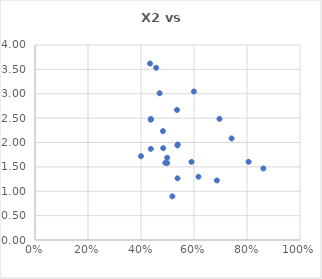
| Category | X3 |
|---|---|
| 0.805833 | 1.604 |
| 0.696087 | 2.485 |
| 0.437273 | 2.483 |
| 0.590435 | 1.603 |
| 0.436957 | 1.869 |
| 0.518261 | 0.896 |
| 0.498696 | 1.687 |
| 0.535833 | 2.668 |
| 0.434167 | 3.62 |
| 0.482917 | 2.233 |
| 0.686364 | 1.221 |
| 0.599545 | 3.046 |
| 0.470417 | 3.01 |
| 0.537826 | 1.265 |
| 0.49875 | 1.58 |
| 0.48375 | 1.884 |
| 0.5375 | 1.94 |
| 0.861667 | 1.468 |
| 0.741739 | 2.083 |
| 0.538333 | 1.959 |
| 0.457083 | 3.532 |
| 0.4 | 1.72 |
| 0.436522 | 2.466 |
| 0.491739 | 1.583 |
| 0.616957 | 1.298 |